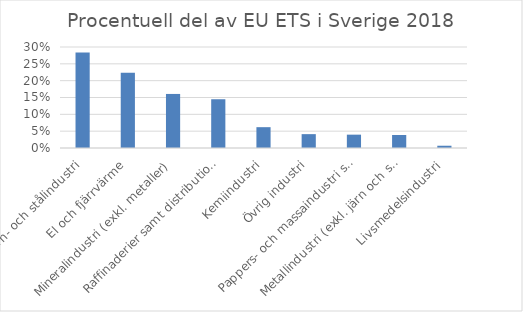
| Category | Procentuell del av EU ETS i Sverige 2018 |
|---|---|
| Järn- och stålindustri | 0.283 |
| El och fjärrvärme | 0.223 |
| Mineralindustri (exkl. metaller) | 0.161 |
| Raffinaderier samt distribution av olja och gas | 0.145 |
| Kemiindustri | 0.062 |
| Övrig industri | 0.041 |
| Pappers- och massaindustri samt tryckerier | 0.04 |
| Metallindustri (exkl. järn och stål) | 0.039 |
| Livsmedelsindustri | 0.007 |